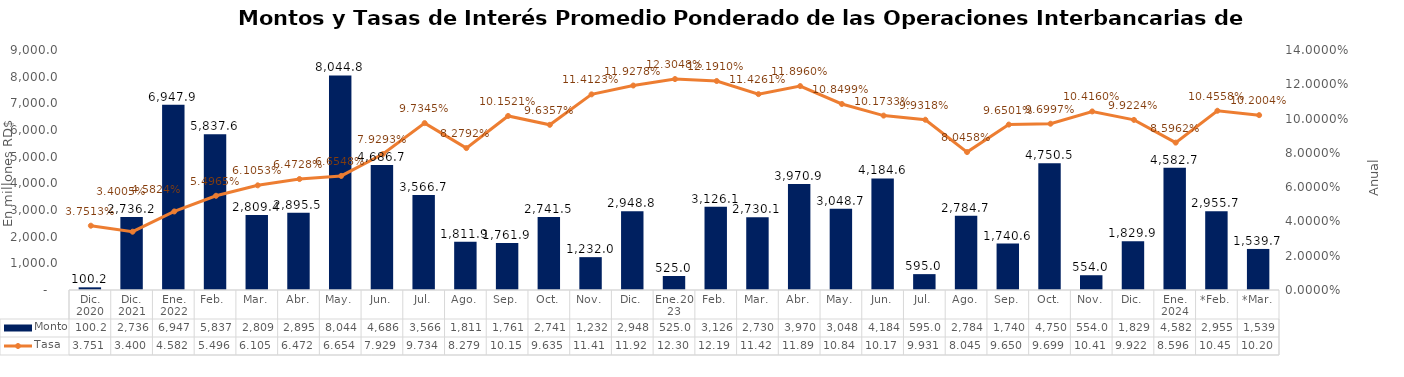
| Category | Monto |
|---|---|
| Dic. 2020 | 100.201 |
| Dic. 2021 | 2736.2 |
| Ene. 2022 | 6947.9 |
| Feb.  | 5837.6 |
| Mar. | 2809.4 |
| Abr. | 2895.51 |
| May. | 8044.816 |
| Jun. | 4686.669 |
| Jul. | 3566.685 |
| Ago. | 1811.857 |
| Sep. | 1761.897 |
| Oct. | 2741.5 |
| Nov. | 1231.977 |
| Dic. | 2948.8 |
| Ene.2023 | 525 |
| Feb. | 3126.05 |
| Mar. | 2730.1 |
| Abr. | 3970.921 |
| May. | 3048.675 |
| Jun. | 4184.629 |
| Jul. | 595 |
| Ago. | 2784.7 |
| Sep. | 1740.568 |
| Oct. | 4750.52 |
| Nov. | 554.01 |
| Dic. | 1829.874 |
| Ene. 2024 | 4582.692 |
| *Feb. | 2955.7 |
| *Mar. | 1539.7 |